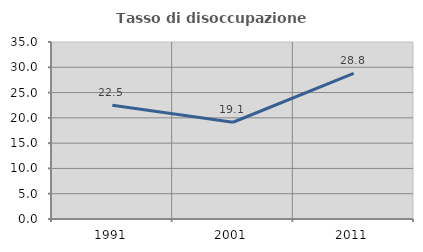
| Category | Tasso di disoccupazione giovanile  |
|---|---|
| 1991.0 | 22.488 |
| 2001.0 | 19.134 |
| 2011.0 | 28.78 |